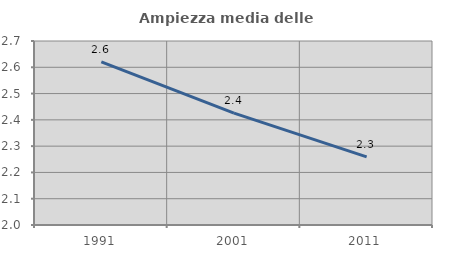
| Category | Ampiezza media delle famiglie |
|---|---|
| 1991.0 | 2.621 |
| 2001.0 | 2.425 |
| 2011.0 | 2.259 |